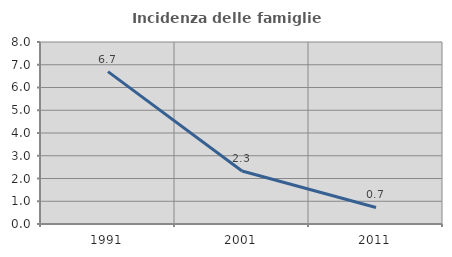
| Category | Incidenza delle famiglie numerose |
|---|---|
| 1991.0 | 6.697 |
| 2001.0 | 2.327 |
| 2011.0 | 0.726 |